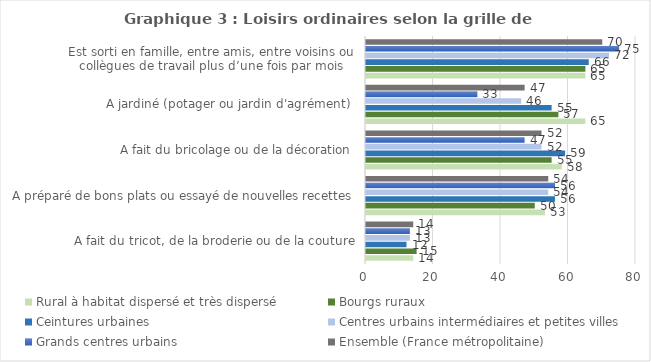
| Category | Rural à habitat dispersé et très dispersé | Bourgs ruraux | Ceintures urbaines | Centres urbains intermédiaires et petites villes | Grands centres urbains | Ensemble (France métropolitaine) |
|---|---|---|---|---|---|---|
| A fait du tricot, de la broderie ou de la couture | 14 | 15 | 12 | 13 | 13 | 14 |
| A préparé de bons plats ou essayé de nouvelles recettes  | 53 | 50 | 56 | 54 | 56 | 54 |
| A fait du bricolage ou de la décoration  | 58 | 55 | 59 | 52 | 47 | 52 |
| A jardiné (potager ou jardin d'agrément)  | 65 | 57 | 55 | 46 | 33 | 47 |
| Est sorti en famille, entre amis, entre voisins ou collègues de travail plus d’une fois par mois | 65 | 65 | 66 | 72 | 75 | 70 |